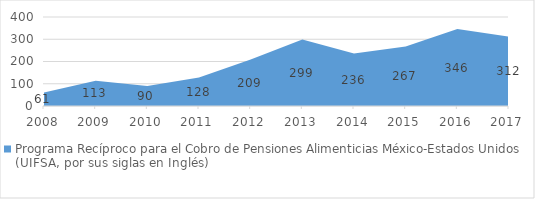
| Category | Programa Recíproco para el Cobro de Pensiones Alimenticias México-Estados Unidos 
(UIFSA, por sus siglas en Inglés) |
|---|---|
| 2008.0 | 61 |
| 2009.0 | 113 |
| 2010.0 | 90 |
| 2011.0 | 128 |
| 2012.0 | 209 |
| 2013.0 | 299 |
| 2014.0 | 236 |
| 2015.0 | 267 |
| 2016.0 | 346 |
| 2017.0 | 312 |